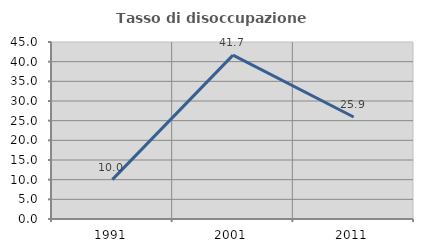
| Category | Tasso di disoccupazione giovanile  |
|---|---|
| 1991.0 | 10 |
| 2001.0 | 41.667 |
| 2011.0 | 25.926 |